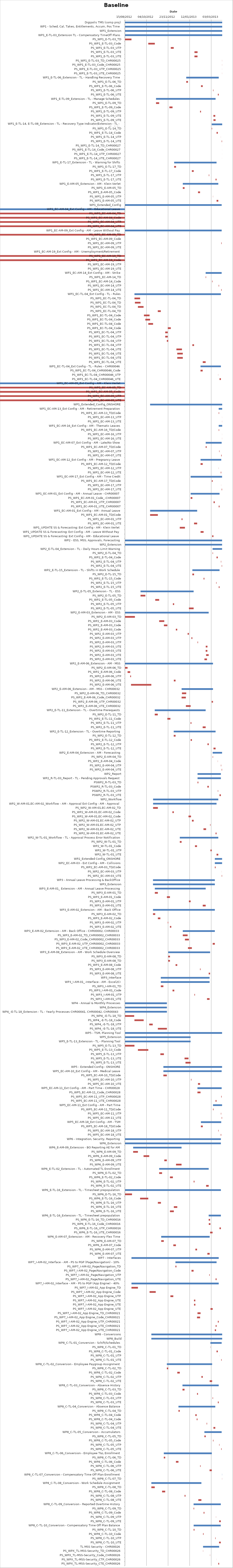
| Category | Baseline start | Actual duration |
|---|---|---|
| Digipolis TMS (comp proj) | 41136.333 | 225.375 |
| WP1 - Sched, Cal, Takes, Entitlements, Accum, Pos Time | 41136.333 | 225.375 |
| WP1_Extension | 41136.333 | 225.375 |
| WP1_E-TL-03_Extension TL - Compensatory TimeOff Plans | 41136.333 | 225.375 |
| PS_WP1_E-TL-03_TD | 41136.333 | 15.125 |
| PS_WP1_E-TL-03_Code | 41190.417 | 15.167 |
| PS_WP1_E-TL-03_UTP | 41242.583 | 6.792 |
| PS_WP1_E-TL-03_UTE | 41297.458 | 7.125 |
| PS_WP1_E-TL-03_UTE | 41297.417 | 7.083 |
| PS_WP1_E-TL-03_TD_CHR00025 | 41361.458 | 0.208 |
| PS_WP1_E-TL-03_Code_CHR00025 | 41361.417 | 0.208 |
| PS_WP1_E-TL-03_UTP_CHR00025 | 41361.625 | 0.083 |
| PS_WP1_E-TL-03_UTE_CHR00025 | 41361.458 | 0.167 |
| WP1_E-TL-06_Extension - TL - Handling Recovery Time | 41278.375 | 75.292 |
| PS_WP1_E-TL-06_TD | 41278.375 | 4.042 |
| PS_WP1_E-TL-06_Code | 41312.583 | 4.042 |
| PS_WP1_E-TL-06_UTP | 41340.542 | 0.917 |
| PS_WP1_E-TL-06_UTE | 41351.667 | 2 |
| WP1_E-TL-09_Extension - TL - Manage Schedules | 41208.333 | 138.042 |
| PS_WP1_E-TL-09_TD | 41208.333 | 7.292 |
| PS_WP1_E-TL-09_Code | 41239.333 | 7.292 |
| PS_WP1_E-TL-09_UTP | 41310.458 | 2.125 |
| PS_WP1_E-TL-09_UTE | 41341.333 | 4.292 |
| PS_WP1_E-TL-09_UTE | 41341.458 | 4.917 |
| WP1_E-TL-14, E-TL-08_Extension - TL - Recovery Type Indicator/Extension - TL - Inconvenient Hours Eligibility | 41337.458 | 24.25 |
| PS_WP1_E-TL-14_TD | 41337.458 | 0.958 |
| PS_WP1_E-TL-14_Code | 41348.667 | 2.958 |
| PS_WP1_E-TL-14_UTP | 41358.542 | 0.125 |
| PS_WP1_E-TL-14_UTE | 41360.458 | 0.917 |
| PS_WP1_E-TL-14_TD_CHR00027 | 41361.667 | 0.042 |
| PS_WP1_E-TL-14_Code_CHR00027 | 41361.625 | 0.042 |
| PS_WP1_E-TL-14_UTP_CHR00027 | 41361.667 | 0.042 |
| PS_WP1_E-TL-14_UTE_CHR00027 | 41361.667 | 0.042 |
| WP1_E-TL-17_Extension - TL - Warning for Shifts | 41250.375 | 98.208 |
| PS_WP1_E-TL-17_TD | 41250.375 | 4.292 |
| PS_WP1_E-TL-17_Code | 41291.417 | 4.292 |
| PS_WP1_E-TL-17_UTP | 41330.625 | 1.042 |
| PS_WP1_E-TL-17_UTE | 41346.375 | 2.208 |
| WP1_E-AM-05_Extension - AM - Klein Verlet | 41270.417 | 82.292 |
| PS_WP1_E-AM-05_TD | 41270.417 | 4.083 |
| PS_WP1_E-AM-05_Code | 41305.667 | 4.708 |
| PS_WP1_E-AM-05_UTP | 41340.375 | 0.333 |
| PS_WP1_E-AM-05_UTE | 41348.667 | 4.042 |
| WP1_Extended_Config | 41136.333 | 224.167 |
| WP1_EC-AM-04_Ext Config - AM - Educational Leave | 41136.333 | -0.625 |
| PS_WP1_EC-AM-04_TD | 41136.333 | -0.625 |
| PS_WP1_EC-AM-04_Code | 41136.333 | -0.625 |
| PS_WP1_EC-AM-04_UTP | 41136.333 | -0.625 |
| PS_WP1_EC-AM-04_UTE | 41136.333 | -0.625 |
| WP1_EC-AM-09_Ext Config - AM - Leave Without Pay | 41136.333 | 224.167 |
| PS_WP1_EC-AM-09_TD | 41136.333 | -0.625 |
| PS_WP1_EC-AM-09_Code | 41136.375 | 0 |
| PS_WP1_EC-AM-09_UTP | 41359.542 | 0.958 |
| PS_WP1_EC-AM-09_UTE | 41360.5 | 0 |
| WP1_EC-AM-19_Ext Config - AM - Unemployment/Retirement | 41136.333 | 0.375 |
| PS_WP1_EC-AM-19_TD | 41136.333 | -0.625 |
| PS_WP1_EC-AM-19_Code | 41136.333 | -0.625 |
| PS_WP1_EC-AM-19_UTP | 41136.333 | 0.375 |
| PS_WP1_EC-AM-19_UTE | 41136.708 | 0 |
| WP1_EC-AM-14_Ext Config - AM - Strike | 41323.375 | 37.083 |
| PS_WP1_EC-AM-14_TD | 41323.375 | 1 |
| PS_WP1_EC-AM-14_Code | 41338.417 | 1 |
| PS_WP1_EC-AM-14_UTP | 41353.458 | 1 |
| PS_WP1_EC-AM-14_UTE | 41359.458 | 1 |
| WP1_EC-TL-04_Ext Config - TL - Rules | 41158.375 | 200.333 |
| PS_WP1_EC-TL-04_TD | 41158.375 | 13.042 |
| PS_WP1_EC-TL-04_TD | 41159.417 | 13.042 |
| PS_WP1_EC-TL-04_TD | 41166.417 | 13.042 |
| PS_WP1_EC-TL-04_TD | 41212.417 | 7 |
| PS_WP1_EC-TL-04_Code | 41180.333 | 13.042 |
| PS_WP1_EC-TL-04_Code | 41183.583 | 11.042 |
| PS_WP1_EC-TL-04_Code | 41190.458 | 11.042 |
| PS_WP1_EC-TL-04_Code | 41235.583 | 7 |
| PS_WP1_EC-TL-04_UTP | 41229.625 | 5.875 |
| PS_WP1_EC-TL-04_UTP | 41229.667 | 5.917 |
| PS_WP1_EC-TL-04_UTP | 41233.417 | 3.292 |
| PS_WP1_EC-TL-04_UTP | 41292.583 | 3.875 |
| PS_WP1_EC-TL-04_UTE | 41255.625 | 12.833 |
| PS_WP1_EC-TL-04_UTE | 41257.542 | 12.833 |
| PS_WP1_EC-TL-04_UTE | 41257.583 | 12.833 |
| PS_WP1_EC-TL-04_UTE | 41316.625 | 6.75 |
| WP1_EC-TL-04_Ext Config - TL - Rules - CHR00046 | 41311.458 | 47.25 |
| PS_WP1_EC-TL-04_CHR00046_Code | 41311.458 | 5 |
| PS_WP1_EC-TL-04_CHR00046_UTP | 41352.375 | 0.25 |
| PS_WP1_EC-TL-04_CHR00046_UTE | 41355.583 | 3.125 |
| WP1_EC-AM-05_Ext Config - AM - Klein Verlet | 41136.333 | -0.625 |
| PS_WP1_EC-AM-05_TD | 41136.333 | -0.625 |
| PS_WP1_EC-AM-05_Code | 41136.333 | -0.625 |
| PS_WP1_EC-AM-05_UTP | 41136.333 | -0.625 |
| PS_WP1_EC-AM-05_UTE | 41136.333 | -0.625 |
| WP1_Extended_Config_ONSHORE | 41194.625 | 167.083 |
| WP1_EC-AM-13_Ext Config - AM - Retirement Preparation | 41353.583 | 8.083 |
| PS_WP1_EC-AM-13_TD/Code | 41353.583 | 1.042 |
| PS_WP1_EC-AM-13_UTP | 41361.375 | 0.083 |
| PS_WP1_EC-AM-13_UTE | 41361.458 | 0.208 |
| WP1_EC-AM-16_Ext Config - AM - Thematic Leaves | 41353.625 | 8.083 |
| PS_WP1_EC-AM-16_TD/Code | 41353.625 | 1.042 |
| PS_WP1_EC-AM-16_UTP | 41361.417 | 0.083 |
| PS_WP1_EC-AM-16_UTE | 41361.542 | 0.167 |
| WP1_EC-AM-07_Ext Config - AM - Late/No Show | 41323.458 | 37 |
| PS_WP1_EC-AM-07_TD/Code | 41323.458 | 2.167 |
| PS_WP1_EC-AM-07_UTP | 41354.667 | 0.792 |
| PS_WP1_EC-AM-07_UTE | 41359.417 | 1.042 |
| WP1_EC-AM-12_Ext Config - AM - Pregnancy Leave | 41311.583 | 47.917 |
| PS_WP1_EC-AM-12_TD/Code | 41311.583 | 5 |
| PS_WP1_EC-AM-12_UTP | 41353.333 | 0.25 |
| PS_WP1_EC-AM-12_UTE | 41358.375 | 1.125 |
| WP1_EC-AM-17_Ext Config - AM - Time Credit | 41288.583 | 72.833 |
| PS_WP1_EC-AM-17_TD/Code | 41337.667 | 1.917 |
| PS_WP1_EC-AM-17_UTP | 41359.333 | 0.125 |
| PS_WP1_EC-AM-17_UTE | 41360.458 | 0.958 |
| WP1_EC-AM-01_Ext Config - AM - Annual Leave - CHR00007 | 41288.583 | 67 |
| PS_WP1_EC-AM-01_Code_­CHR00007 | 41288.583 | 4 |
| PS_WP1_EC-AM-01_UTP_CHR00007 | 41341.667 | 2.917 |
| PS_WP1_EC-AM-01_UTE_CHR00007 | 41353.625 | 1.958 |
| WP1_EC-AM-01_Ext Config - AM - Annual Leave | 41194.625 | 109.083 |
| PS_WP1_EC-AM-01_TD/Code | 41194.625 | 18 |
| PS_WP1_EC-AM-01_UTP | 41267.542 | 2.125 |
| PS_WP1_EC-AM-01_UTE | 41296.458 | 7.25 |
| WP1_UPDATE SS & Forecasting: Ext Config - AM - Klein Verlet | 41263.375 | 12 |
| WP1_UPDATE SS & Forecasting: Ext Config - AM - Leave Without Pay | 41311.583 | 7 |
| WP1_UPDATE SS & Forecasting: Ext Config - AM - Educational Leave | 41338.417 | 3 |
| WP2 - ESS, MSS, Approvals, Forecasting | 41136.333 | 225.125 |
| WP2_Extension | 41136.333 | 225.125 |
| WP2_E-TL-04_Extension - TL - Daily Hours Limit Warning | 41339.417 | 22.042 |
| PS_WP2_E-TL-04_TD | 41339.417 | 0.958 |
| PS_WP2_E-TL-04_Code | 41348.583 | 2.917 |
| PS_WP2_E-TL-04_UTP | 41358.667 | 0.75 |
| PS_WP2_E-TL-04_UTE | 41360.542 | 0.917 |
| WP2_E-TL-15_Extension - TL - Shifts in Work Schedule | 41292.583 | 63 |
| PS_WP2_E-TL-15_TD | 41292.583 | 3.875 |
| PS_WP2_E-TL-15_Code | 41318.583 | 1.875 |
| PS_WP2_E-TL-15_UTP | 41347.667 | 0.917 |
| PS_WP2_E-TL-15_UTE | 41353.667 | 1.917 |
| WP2_E-TL-05_Extension - TL - ESS | 41172.458 | 123.042 |
| PS_WP2_E-TL-05_TD | 41172.458 | 11.125 |
| PS_WP2_E-TL-05_Code | 41206.542 | 9.083 |
| PS_WP2_E-TL-05_UTP | 41247.417 | 2.958 |
| PS_WP2_E-TL-05_UTE | 41284.625 | 10.875 |
| WP2_E-AM-03_Extension - AM - ESS | 41136.333 | 194.042 |
| PS_WP2_E-AM-03_TD | 41136.333 | 23.083 |
| PS_WP2_E-AM-03_Code | 41215.625 | 11.875 |
| PS_WP2_E-AM-03_Code | 41226.625 | 8 |
| PS_WP2_E-AM-03_Code | 41254.333 | 3.167 |
| PS_WP2_E-AM-03_UTP | 41281.583 | 3.042 |
| PS_WP2_E-AM-03_UTP | 41290.417 | 2.167 |
| PS_WP2_E-AM-03_UTP | 41304.542 | 1.125 |
| PS_WP2_E-AM-03_UTE | 41323.583 | 4 |
| PS_WP2_E-AM-03_UTE | 41323.375 | 4 |
| PS_WP2_E-AM-03_UTE | 41324.375 | 6 |
| PS_WP2_E-AM-03_UTE | 41320.542 | 5.958 |
| WP2_E-AM-06_Extension - AM - MSS | 41136.333 | 204.042 |
| PS_WP2_E-AM-06_TD | 41136.333 | 6.083 |
| PS_WP2_E-AM-06_Code | 41142.417 | 6.083 |
| PS_WP2_E-AM-06_UTP | 41148.542 | 1.875 |
| PS_WP2_E-AM-06_UTE | 41249.625 | 4 |
| PS_WP2_E-AM-06_UTE | 41150.417 | 47.083 |
| WP2_E-AM-06_Extension - AM - MSS - CHR00032 | 41267.625 | 72.75 |
| PS_WP2_E-AM-06_TD_CHR00032 | 41268.458 | 9.917 |
| PS_WP2_E-AM-06_Code_CHR00032 | 41267.625 | 9.875 |
| PS_WP2_E-AM-06_UTP_CHR00032 | 41337.333 | 3.042 |
| PS_WP2_E-AM-06_UTE_CHR00032 | 41277.542 | 11.083 |
| WP2_E-TL-11_Extension - TL - Overtime Prerequests | 41205.375 | 118 |
| PS_WP2_E-TL-11_TD | 41205.375 | 7.042 |
| PS_WP2_E-TL-11_Code | 41234.625 | 7.042 |
| PS_WP2_E-TL-11_UTP | 41288.417 | 2 |
| PS_WP2_E-TL-11_UTE | 41316.458 | 6.917 |
| WP2_E-TL-12_Extension - TL - Overtime Reporting | 41249.375 | 97 |
| PS_WP2_E-TL-12_TD | 41249.375 | 4.333 |
| PS_WP2_E-TL-12_Code | 41288.625 | 2.958 |
| PS_WP2_E-TL-12_UTP | 41327.583 | 3.042 |
| PS_WP2_E-TL-12_UTE | 41341.542 | 4.833 |
| WP2_E-AM-04_Extension - AM - Forecasting | 41339.583 | 21.833 |
| PS_WP2_E-AM-04_TD | 41339.583 | 0.917 |
| PS_WP2_E-AM-04_Code | 41351.333 | 0.333 |
| PS_WP2_E-AM-04_UTP | 41358.667 | 0.75 |
| PS_WP2_E-AM-04_UTE | 41360.458 | 0.958 |
| WP2_Report | 41304.583 | 54.083 |
| WP2_R-TL-03_Report - TL - Pending Approvals Request | 41304.583 | 54.083 |
| PSWP2_R-TL-03_TD | 41304.583 | 1.833 |
| PSWP2_R-TL-03_Code | 41327.375 | 3.25 |
| PSWP2_R-TL-03_UTP | 41351.542 | 0.833 |
| PSWP2_R-TL-03_UTE | 41355.458 | 3.208 |
| WP2_Workflow | 41201.542 | 151.125 |
| WP2_W-AM-01,EC-AM-02_Workflow - AM - Approval Ext Config - AM - Approval | 41201.542 | 147.042 |
| PS_WP2_W-AM-01,EC-AM-02_TD | 41201.542 | 11.083 |
| PS_WP2_W-AM-01,EC-AM-02_Code | 41246.333 | 3.292 |
| PS_WP2_W-AM-01,EC-AM-02_Code | 41283.625 | 5.792 |
| PS_WP2_W-AM-01,EC-AM-02_UTP | 41291.583 | 4 |
| PS_WP2_W-AM-01,EC-AM-02_UTP | 41333.625 | 0.958 |
| PS_WP2_W-AM-01,EC-AM-02_UTE | 41318.333 | 6.083 |
| PS_WP2_W-AM-01,EC-AM-02_UTE | 41346.375 | 2.208 |
| WP2_W-TL-01_Workflow - TL - Approval Process Error Notification | 41263.458 | 89.208 |
| PS_WP2_W-TL-01_TD | 41263.458 | 4.167 |
| WP2_W-TL-01_Code | 41298.625 | 4.75 |
| WP2_W-TL-01_UTP | 41334.458 | 3 |
| WP2_W-TL-01_UTE | 41348.583 | 4.083 |
| WP2_Extended Config_ONSHORE | 41344.667 | 16.792 |
| WP2_EC-AM-03 - Ext Config - AM - Collisions | 41344.667 | 16.792 |
| PS_WP2_EC-AM-03_TD/Code | 41344.667 | 1.792 |
| PS_WP2_EC-AM-03_UTP | 41360.458 | 0.125 |
| PS_WP2_EC-AM-03_UTE | 41360.583 | 0.875 |
| WP3 - Annual Leave Processing & BackOffice | 41201.333 | 143.333 |
| WP3_Extension | 41201.333 | 143.333 |
| WP3_E-AM-01_ Extension - AM - Annual Leave Processing | 41205.583 | 117.875 |
| PS_WP3_E-AM-01_TD | 41205.583 | 7.042 |
| PS_WP3_E-AM-01_Code | 41233.583 | 7.042 |
| PS_WP3_E-AM-01_UTP | 41284.583 | 4 |
| PS_WP3_E-AM-01_UTE | 41316.583 | 6.875 |
| WP3_E-AM-02_Extension - AM - Back Office | 41201.333 | 143.333 |
| PS_WP3_E-AM-02_TD | 41201.333 | 5.167 |
| PS_WP3_E-AM-02_Code | 41212.625 | 5.792 |
| PS_WP3_E-AM-02_UTP | 41235.542 | 1.125 |
| PS_WP3_E-AM-02_UTE | 41240.625 | 3.083 |
| WP3_E-AM-02_Extension - AM - Back Office - CHR00002, CHR00033 | 41270.375 | 74.292 |
| PS_WP3_E-AM-02_TD_CHR00002_CHR00033 | 41270.375 | 11.208 |
| PS_WP3_E-AM-02_Code_CHR00002_CHR00033 | 41275.375 | 9.208 |
| PS_WP3_E-AM-02_UTP_CHR00002_CHR00033 | 41339.667 | 5 |
| PS_WP3_E-AM-02_UTE_CHR00002_CHR00033 | 41282.417 | 9 |
| WP3_E-AM-08_Extension - AM - Work Schedule Overview | 41236.667 | 97 |
| PS_WP3_E-AM-08_TD | 41236.667 | 4 |
| PS_WP3_E-AM-08_TD | 41236.667 | 3.958 |
| PS_WP3_E-AM-08_Code | 41253.625 | 3.958 |
| PS_WP3_E-AM-08_UTP | 41310.375 | 1.208 |
| PS_WP3_E-AM-08_UTE | 41330.417 | 3.25 |
| WP3_Interface | 41219.417 | 113.042 |
| WP3_I-AM-01_­Interface - AM - Excel2CI | 41219.417 | 113.042 |
| PS_WP3_I-AM-01_TD | 41219.417 | 6 |
| PS_WP3_I-AM-01_Code | 41246.625 | 4.083 |
| PS_WP3_I-AM-01_UTP | 41297.333 | 1.292 |
| PS_WP3_I-AM-01_UTE | 41326.542 | 5.917 |
| WP4 - Annual & Monthly Processes | 41136.333 | 97.25 |
| WP4_Extension | 41136.333 | 97.25 |
| WP4_­E-TL-18_Extension - TL - Yearly Processes CHR00041, CHR00042, CHR00043 | 41136.333 | 97.25 |
| PS_WP4_­E-TL-18_TD | 41136.333 | 21.375 |
| PS_WP4_­E-TL-18_Code | 41158.333 | 21.375 |
| PS_WP4_­E-TL-18_UTP | 41192.583 | 8.125 |
| PS_WP4_­E-TL-18_UTE | 41212.625 | 20.958 |
| WP5 - TSM, Planning Tool | 41136.333 | 225.083 |
| WP5_Extension | 41136.333 | 152.083 |
| WP5_E-TL-13_Extension - TL - Planning Tool | 41136.333 | 152.083 |
| PS_WP5_E-TL-13_TD | 41136.333 | 22.042 |
| PS_WP5_E-TL-13_Code | 41166.417 | 24.042 |
| PS_WP5_E-TL-13_UTP | 41218.417 | 8.208 |
| PS_WP5_E-TL-13_UTE | 41274.417 | 9.208 |
| PS_WP5_E-TL-13_UTE | 41276.625 | 11.792 |
| WP5 - Extended Config - ONSHORE | 41225.417 | 136 |
| WP5_EC-AM-10_Ext Config - AM - Medical Leave | 41225.417 | 135.042 |
| PS_WP5_EC-AM-10_TD/Code | 41225.417 | 8 |
| PS_WP5_EC-AM-10_UTP | 41289.417 | 1.083 |
| PS_WP5_EC-AM-10_UTE | 41305.583 | 4.875 |
| WP5_EC-AM-11_Ext Config - AM - Part Time - CHR00028 | 41304.333 | 56.125 |
| PS_WP5_EC-AM-11_Code_CHR00028 | 41304.333 | 7.125 |
| PS_WP5_EC-AM-11_UTP_CHR00028 | 41359.417 | 1.042 |
| PS_WP5_EC-AM-11_UTE_CHR00028 | 41346.333 | 2.167 |
| WP5_EC-AM-11_Ext Config - AM - Part Time | 41340.375 | 21.042 |
| PS_WP5_EC-AM-11_TD/Code | 41340.375 | 1.292 |
| PS_WP5_EC-AM-11_UTP | 41358.667 | 0.75 |
| PS_WP5_EC-AM-11_UTE | 41360.458 | 0.958 |
| WP5_EC-AM-18_Ext Config - AM - TSM | 41312.333 | 47.125 |
| PS_WP5_EC-AM-18_TD/Code | 41312.333 | 4.375 |
| PS_WP5_EC-AM-18_UTP | 41352.625 | 0.833 |
| PS_WP5_EC-AM-18_UTE | 41358.333 | 1.125 |
| WP6 - Integration, Security, Reporting | 41136.333 | 222.333 |
| WP6_Extension | 41136.333 | 222.333 |
| WP6_E-AM-09_Extension - BO Reporting AE for AM | 41155.333 | 112.167 |
| PS_WP6_E-AM-09_TD | 41155.333 | 11.083 |
| PS_WP6_E-AM-09_Code | 41179.458 | 13.125 |
| PS_WP6_E-AM-09_UTP | 41227.542 | 5.875 |
| PS_WP6_E-AM-09_UTE | 41254.667 | 12.833 |
| WP6_E-TL-02_Extension - TL - Automated TL Enrollment | 41215.625 | 114.792 |
| PS_WP6_E-TL-02_TD | 41215.625 | 6.75 |
| PS_WP6_E-TL-02_Code | 41240.667 | 6.75 |
| PS_WP6_E-TL-02_UTP | 41295.583 | 1.875 |
| PS_WP6_E-TL-02_UTE | 41324.417 | 6 |
| WP6_E-TL-16_Extension - TL - Timesheet prepopulation | 41136.333 | 222.333 |
| PS_WP6_E-TL-16_TD | 41136.333 | 16.375 |
| PS_WP6_E-TL-16_Code | 41171.417 | 19 |
| PS_WP6_E-TL-16_UTP | 41212.625 | 7.083 |
| PS_WP6_E-TL-16_UTE | 41249.625 | 8 |
| PS_WP6_E-TL-16_UTE | 41240.625 | 9 |
| WP6_E-TL-16_Extension - TL - Timesheet prepopulation | 41330.375 | 28.292 |
| PS_WP6_E-TL-16_TD_CHR00016 | 41330.375 | 3.25 |
| PS_WP6_E-TL-16_Code_CHR00016 | 41330.625 | 3.833 |
| PS_WP6_E-TL-16_UTP_CHR00016 | 41355.458 | 3.208 |
| PS_WP6_E-TL-16_UTE_CHR00016 | 41333.667 | 5.75 |
| WP6_E-AM-07_Extension - AM - Recovery Flex Time | 41220.333 | 112.333 |
| PS_WP6_E-AM-07_TD | 41220.333 | 6.042 |
| PS_WP6_E-AM-07_Code | 41248.417 | 6.042 |
| PS_WP6_E-AM-07_UTP | 41299.583 | 3.833 |
| PS_WP6_E-AM-07_UTE | 41327.333 | 5.333 |
| WP7 - Interfaces | 41151.458 | 202.167 |
| WP7_I-AM-02_Interface - AM - PS to PGP (Page/Navigation) - 10% | 41253.333 | 95.333 |
| PS_WP7_I-AM-02_Page/Navigation_TD | 41253.333 | 2.292 |
| PS_WP7_I-AM-02_Page/Navigation_Code | 41290.542 | 4.875 |
| PS_WP7_I-AM-02_Page/Navigation_UTP | 41331.667 | 1.042 |
| PS_WP7_I-AM-02_Page/Navigation_UTE | 41346.458 | 2.208 |
| WP7_I-AM-02_Interface - AM - PS to PGP (App Engine) - 40% | 41151.458 | 202.167 |
| PS_WP7_I-AM-02_App Engine_TD | 41151.458 | 14.958 |
| PS_WP7_I-AM-02_App Engine_Code | 41193.375 | 14.333 |
| PS_WP7_I-AM-02_App Engine_UTP | 41241.667 | 6.75 |
| PS_WP7_I-AM-02_App Engine_UTE | 41296.333 | 3.083 |
| PS_WP7_I-AM-02_App Engine_UTE | 41296.458 | 3.125 |
| PS_WP7_I-AM-02_App Engine_UTE | 41334.583 | 5.083 |
| PS_WP7_I-AM-02_App Engine_TD_CHR00021 | 41304.417 | 7.167 |
| PS_WP7_I-AM-02_App Engine_Code_CHR00021 | 41303.375 | 7.125 |
| PS_WP7_I-AM-02_App Engine_UTP_CHR00021 | 41351.583 | 2.042 |
| PS_WP7_I-AM-02_App Engine_UTE_CHR00021 | 41346.542 | 2.167 |
| PS_WP7_I-AM-02_App Engine_UTE_CHR00021 | 41344.583 | 2.792 |
| WP8 - Conversions | 41197.542 | 164.125 |
| WP8_Build | 41197.542 | 164.125 |
| WP8_C-TL-01_Conversion - Schift/Schedules | 41334.333 | 26.125 |
| PS_WP8_C-TL-01_TD | 41334.333 | 0.375 |
| PS_WP8_C-TL-01_Code | 41348.583 | 3 |
| PS_WP8_C-TL-01_UTP | 41355.583 | 0.125 |
| PS_WP8_C-TL-01_UTE | 41359.458 | 1 |
| WP8_C-TL-02_Conversion - Employee Paygroup Assignment | 41233.417 | 105 |
| PS_WP8_C-TL-02_TD | 41233.417 | 3.25 |
| PS_WP8_C-TL-02_Code | 41257.625 | 5.833 |
| PS_WP8_C-TL-02_UTP | 41313.542 | 3.167 |
| PS_WP8_C-TL-02_UTE | 41332.667 | 5.75 |
| WP8_C-TL-03_Conversion - Absence History | 41269.667 | 83.958 |
| PS_WP8_C-TL-03_TD | 41269.667 | 4.75 |
| PS_WP8_C-TL-03_Code | 41303.417 | 2.167 |
| PS_WP8_C-TL-03_UTP | 41339.417 | 1 |
| PS_WP8_C-TL-03_UTE | 41351.625 | 2 |
| WP8_C-TL-04_Conversion - Absence Balance | 41260.375 | 85.333 |
| PS_WP8_C-TL-04_TD | 41260.375 | 3 |
| PS_WP8_C-TL-04_Code | 41299.417 | 3.208 |
| PS_WP8_C-TL-04_Code | 41302.625 | 1.792 |
| PS_WP8_C-TL-04_UTP | 41325.625 | 1.083 |
| PS_WP8_C-TL-04_UTE | 41341.417 | 4.292 |
| WP8_C-TL-05_Conversion - Accumulators | 41320.458 | 40 |
| PS_WP8_C-TL-05_TD | 41320.458 | 3.125 |
| PS_WP8_C-TL-05_Code | 41340.417 | 1.083 |
| PS_WP8_C-TL-05_UTP | 41354.667 | 0.792 |
| PS_WP8_C-TL-05_UTE | 41359.417 | 1.042 |
| WP8_C-TL-06_Conversion - Employee T&L Enrollment | 41226.375 | 111.292 |
| PS_WP8_C-TL-06_TD | 41226.375 | 3.292 |
| PS_WP8_C-TL-06_Code | 41254.458 | 5.917 |
| PS_WP8_C-TL-06_UTP | 41310.542 | 1.167 |
| PS_WP8_C-TL-06_UTE | 41332.458 | 5.208 |
| WP8_C-TL-07_Conversion - Compensatory Time Off Plan Enrollment | 41361.417 | 0.25 |
| PS_WP8_C-TL-07_TD | 41361.417 | 0.25 |
| WP8_C-TL-08_Conversion - Work Schedule Assignment | 41197.542 | 115.958 |
| PS_WP8_C-TL-08_TD | 41197.542 | 7.833 |
| PS_WP8_C-TL-08_Code | 41222.375 | 7.25 |
| PS_WP8_C-TL-08_UTP | 41274.542 | 2.083 |
| PS_WP8_C-TL-08_UTE | 41306.417 | 7.083 |
| WP8_C-TL-09_Conversion - Reported Overtime History | 41295.417 | 63.083 |
| PS_WP8_C-TL-09_TD | 41295.417 | 1.292 |
| PS_WP8_C-TL-09_Code | 41318.625 | 1.875 |
| PS_WP8_C-TL-09_UTP | 41347.375 | 0.292 |
| PS_WP8_C-TL-09_UTE | 41354.625 | 3.875 |
| WP8_C-TL-10_Conversion - Compensatory Time Off Plan Balance | 41295.542 | 62.833 |
| PS_WP8_C-TL-10_TD | 41295.542 | 1.875 |
| PS_WP8_C-TL-10_Code | 41317.333 | 1.292 |
| PS_WP8_C-TL-10_UTP | 41345.625 | 0.875 |
| PS_WP8_C-TL-10_UTE | 41354.458 | 3.917 |
| TL MSS Security - CHR00026 | 41317.333 | 37.333 |
| PS_WPX_TL-MSS-Security_TD_CHR00026 | 41317.333 | 0.375 |
| PS_WPX_TL-MSS-Security_Code_CHR00026 | 41333.333 | 0.375 |
| PS_WPX_TL-MSS-Security_CTP_CHR00026 | 41348.542 | 0.125 |
| PS_WPX_TL-MSS-Security_CTE_CHR00026 | 41352.667 | 2 |